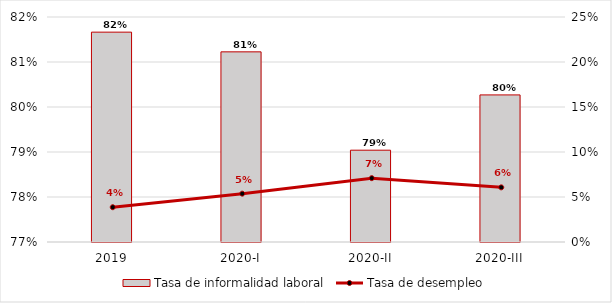
| Category | Tasa de informalidad laboral |
|---|---|
| 2019 | 0.817 |
| 2020-I | 0.812 |
| 2020-II | 0.79 |
| 2020-III | 0.803 |